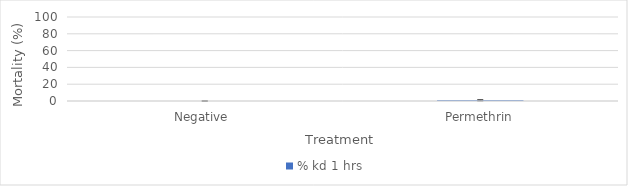
| Category | % kd 1 hrs |
|---|---|
| Negative  | 0 |
| Permethrin | 0.943 |